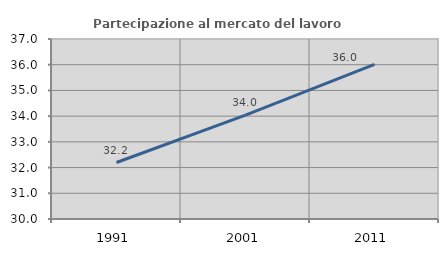
| Category | Partecipazione al mercato del lavoro  femminile |
|---|---|
| 1991.0 | 32.197 |
| 2001.0 | 34.04 |
| 2011.0 | 36.016 |